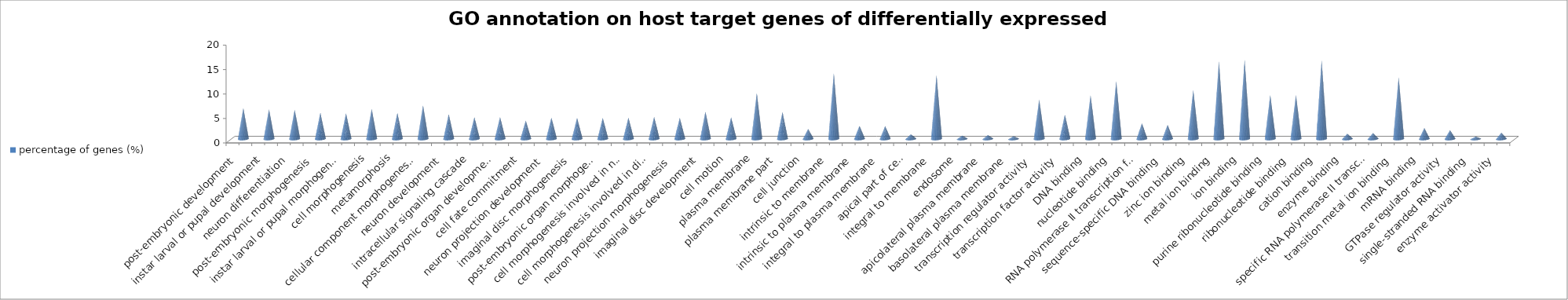
| Category | percentage of genes (%) |
|---|---|
| post-embryonic development | 6.305 |
| instar larval or pupal development | 6.105 |
| neuron differentiation | 5.986 |
| post-embryonic morphogenesis | 5.347 |
| instar larval or pupal morphogenesis | 5.227 |
| cell morphogenesis | 6.145 |
| metamorphosis | 5.307 |
| cellular component morphogenesis | 6.864 |
| neuron development | 5.068 |
| intracellular signaling cascade | 4.469 |
| post-embryonic organ development | 4.469 |
| cell fate commitment | 3.751 |
| neuron projection development | 4.35 |
| imaginal disc morphogenesis | 4.31 |
| post-embryonic organ morphogenesis | 4.31 |
| cell morphogenesis involved in neuron differentiation | 4.35 |
| cell morphogenesis involved in differentiation | 4.509 |
| neuron projection morphogenesis | 4.31 |
| imaginal disc development | 5.587 |
| cell motion | 4.389 |
| plasma membrane | 9.338 |
| plasma membrane part | 5.507 |
| cell junction | 2.035 |
| intrinsic to membrane | 13.408 |
| intrinsic to plasma membrane | 2.674 |
| integral to plasma membrane | 2.634 |
| apical part of cell | 0.958 |
| integral to membrane | 13.049 |
| endosome | 0.678 |
| apicolateral plasma membrane | 0.798 |
| basolateral plasma membrane | 0.559 |
| transcription regulator activity | 8.061 |
| transcription factor activity | 4.948 |
| DNA binding | 8.899 |
| nucleotide binding | 11.812 |
| RNA polymerase II transcription factor activity | 3.192 |
| sequence-specific DNA binding | 2.873 |
| zinc ion binding | 10.016 |
| metal ion binding | 15.842 |
| ion binding | 16.161 |
| purine ribonucleotide binding | 8.978 |
| ribonucleotide binding | 8.978 |
| cation binding | 16.042 |
| enzyme binding | 1.077 |
| specific RNA polymerase II transcription factor activity | 1.197 |
| transition metal ion binding | 12.61 |
| mRNA binding | 2.235 |
| GTPase regulator activity | 1.796 |
| single-stranded RNA binding | 0.479 |
| enzyme activator activity | 1.277 |